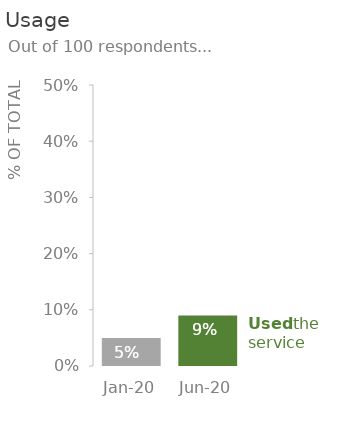
| Category | Used |
|---|---|
| 2020-01-01 | 0.05 |
| 2020-06-01 | 0.09 |